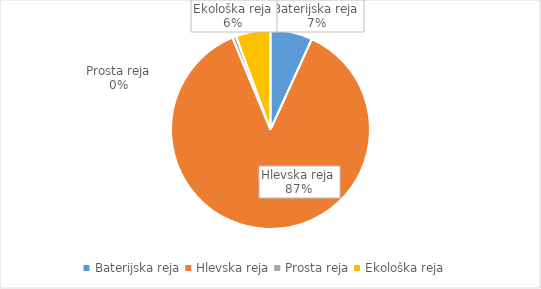
| Category | Količina kosov jajc |
|---|---|
| Baterijska reja | 233226 |
| Hlevska reja | 2975563 |
| Prosta reja | 20910 |
| Ekološka reja | 193289 |